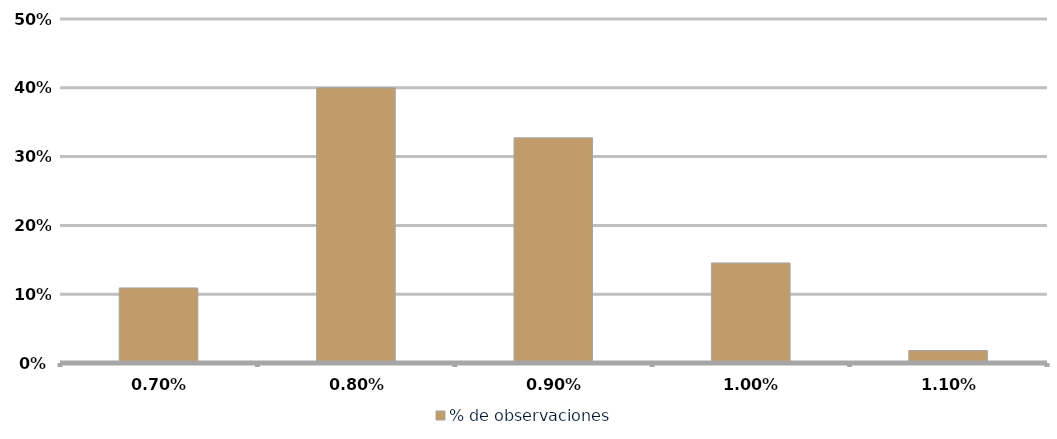
| Category | % de observaciones  |
|---|---|
| 0.007 | 0.109 |
| 0.008 | 0.4 |
| 0.009000000000000001 | 0.327 |
| 0.010000000000000002 | 0.145 |
| 0.011000000000000003 | 0.018 |